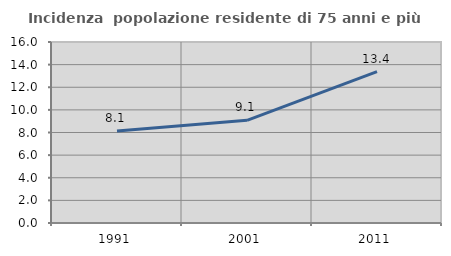
| Category | Incidenza  popolazione residente di 75 anni e più |
|---|---|
| 1991.0 | 8.138 |
| 2001.0 | 9.079 |
| 2011.0 | 13.383 |